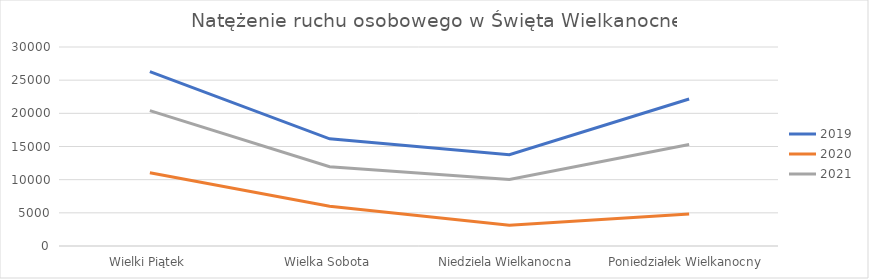
| Category | 2019 | 2020 | 2021 |
|---|---|---|---|
| Wielki Piątek | 26290 | 11052 | 20416 |
| Wielka Sobota | 16161 | 5981 | 11943 |
| Niedziela Wielkanocna | 13763 | 3126 | 10030 |
| Poniedziałek Wielkanocny | 22159 | 4834 | 15307 |